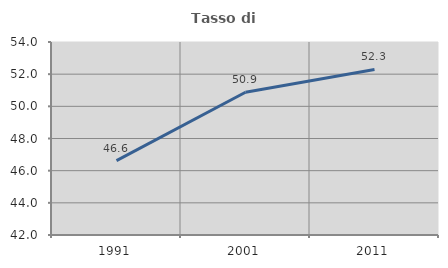
| Category | Tasso di occupazione   |
|---|---|
| 1991.0 | 46.629 |
| 2001.0 | 50.877 |
| 2011.0 | 52.292 |